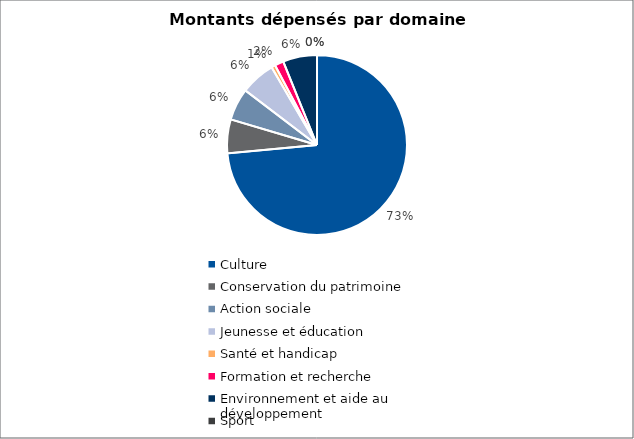
| Category | Series 0 |
|---|---|
| Culture | 9916750 |
| Conservation du patrimoine | 819500 |
| Action sociale | 777100 |
| Jeunesse et éducation | 840800 |
| Santé et handicap | 95300 |
| Formation et recherche | 215000 |
| Environnement et aide au
développement | 824600 |
| Sport | 0 |
| Autres projets d’utilité publique | 0 |